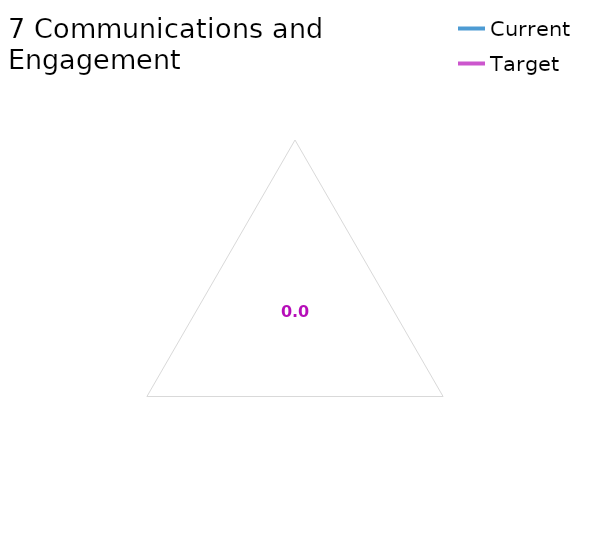
| Category | Current | Target |
|---|---|---|
| 7 Communications and Engagement average | 0 | 0 |
| 7.1 Compelling communications narrative | 0 | 0 |
| 7.2 Online and other resources | 0 | 0 |